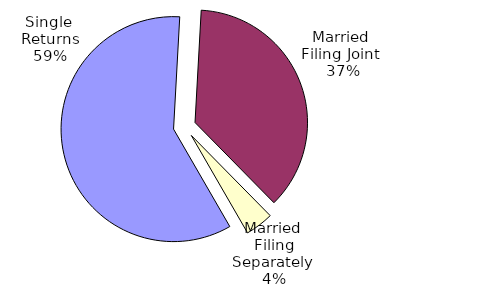
| Category | Series 0 |
|---|---|
| Single 
Returns | 2413420 |
| Married 
Filing Joint  | 1498003 |
| Married 
Filing Separately  | 164544 |